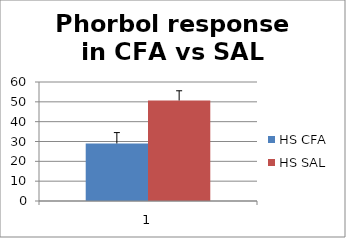
| Category | HS CFA | HS SAL |
|---|---|---|
| 0 | 28.992 | 50.675 |